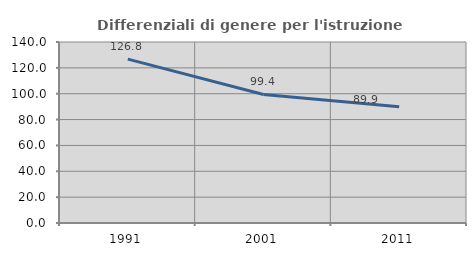
| Category | Differenziali di genere per l'istruzione superiore |
|---|---|
| 1991.0 | 126.77 |
| 2001.0 | 99.438 |
| 2011.0 | 89.9 |